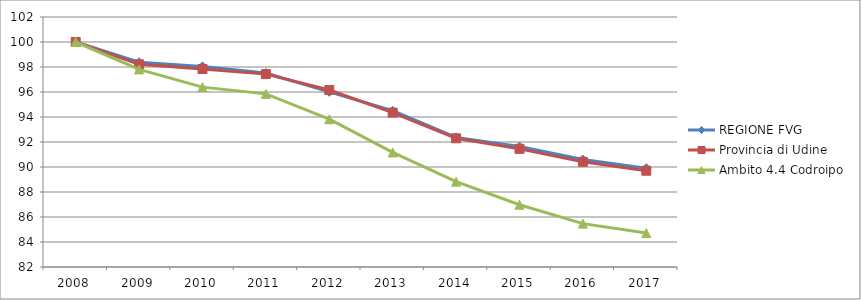
| Category | REGIONE FVG | Provincia di Udine | Ambito 4.4 Codroipo |
|---|---|---|---|
| 2008.0 | 100 | 100 | 100 |
| 2009.0 | 98.378 | 98.213 | 97.809 |
| 2010.0 | 98.049 | 97.839 | 96.39 |
| 2011.0 | 97.515 | 97.431 | 95.851 |
| 2012.0 | 96.012 | 96.162 | 93.822 |
| 2013.0 | 94.5 | 94.348 | 91.164 |
| 2014.0 | 92.37 | 92.296 | 88.829 |
| 2015.0 | 91.632 | 91.451 | 86.979 |
| 2016.0 | 90.595 | 90.414 | 85.471 |
| 2017.0 | 89.908 | 89.702 | 84.716 |